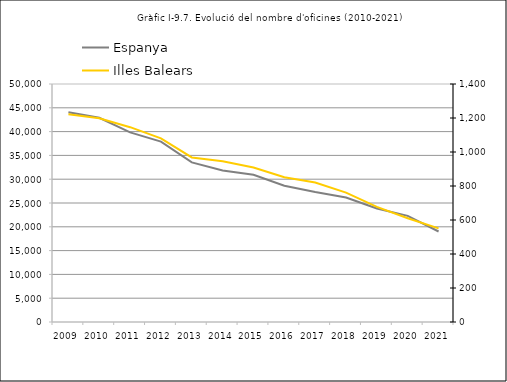
| Category | Espanya |
|---|---|
| 2009.0 | 44085 |
| 2010.0 | 42894 |
| 2011.0 | 39843 |
| 2012.0 | 37903 |
| 2013.0 | 33527 |
| 2014.0 | 31817 |
| 2015.0 | 30921 |
| 2016.0 | 28643 |
| 2017.0 | 27320 |
| 2018.0 | 26166 |
| 2019.0 | 23851 |
| 2020.0 | 22299 |
| 2021.0 | 19015 |